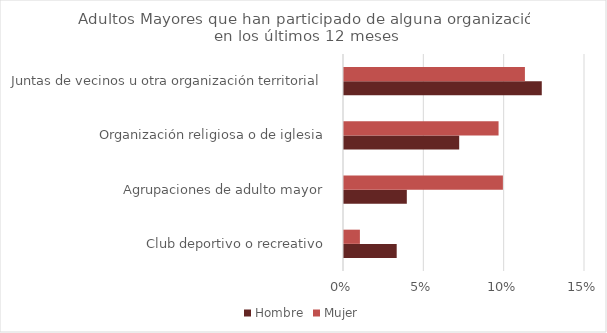
| Category | Hombre | Mujer |
|---|---|---|
| Club deportivo o recreativo | 0.033 | 0.01 |
| Agrupaciones de adulto mayor | 0.039 | 0.099 |
| Organización religiosa o de iglesia | 0.072 | 0.096 |
| Juntas de vecinos u otra organización territorial | 0.123 | 0.113 |